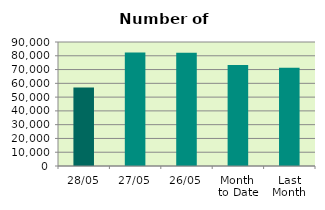
| Category | Series 0 |
|---|---|
| 28/05 | 56972 |
| 27/05 | 82458 |
| 26/05 | 82118 |
| Month 
to Date | 73363.368 |
| Last
Month | 71251.4 |